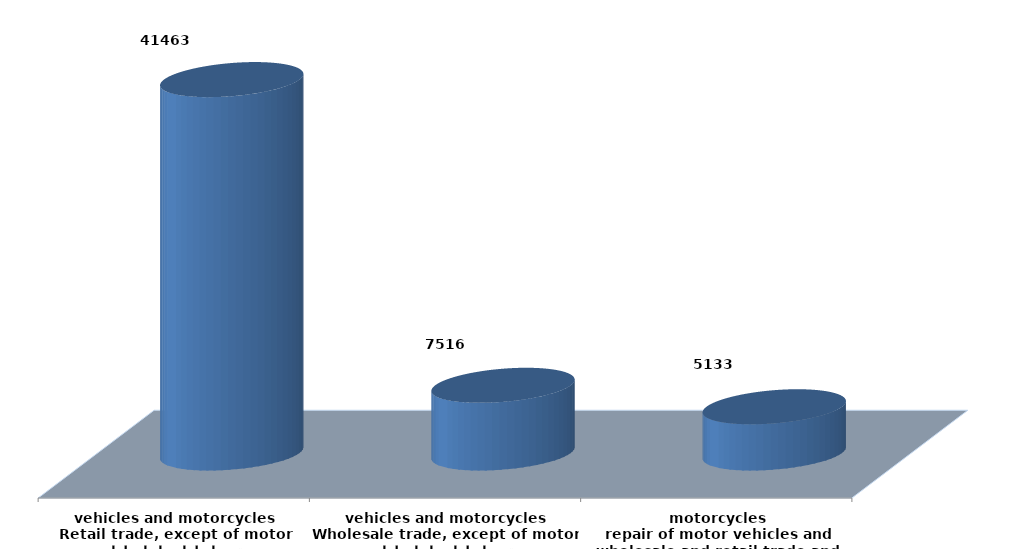
| Category | Series 0 |
|---|---|
| تجارة الجملة والتجزئة ،واصلاح المركبات ذات المحركات والدراجات النارية
wholesale and retail trade and repair of motor vehicles and motorcycles | 5133290 |
| تجارة الجملة ، باستثناء المركبات ذات المحركات والدراجات النارية
Wholesale trade, except of motor vehicles and motorcycles | 7516265 |
| تجارة التجزئة،باستثناء المركبات ذات المحركات والدراجات النارية
Retail trade, except of motor vehicles and motorcycles | 41463157 |